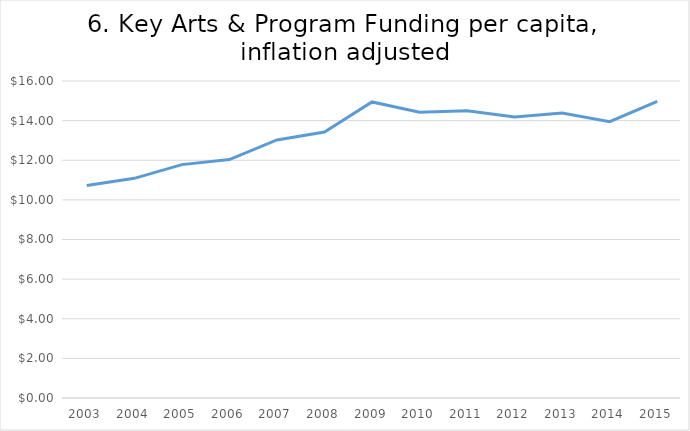
| Category | Series 0 |
|---|---|
| 2003.0 | 10.723 |
| 2004.0 | 11.087 |
| 2005.0 | 11.779 |
| 2006.0 | 12.034 |
| 2007.0 | 13.025 |
| 2008.0 | 13.421 |
| 2009.0 | 14.942 |
| 2010.0 | 14.427 |
| 2011.0 | 14.492 |
| 2012.0 | 14.18 |
| 2013.0 | 14.383 |
| 2014.0 | 13.948 |
| 2015.0 | 14.973 |